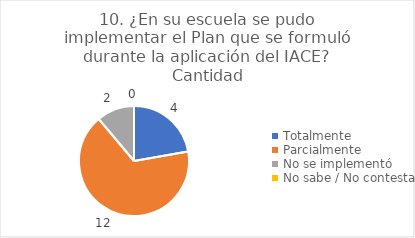
| Category | 10. ¿En su escuela se pudo implementar el Plan que se formuló durante la aplicación del IACE? |
|---|---|
| Totalmente  | 0.222 |
| Parcialmente  | 0.667 |
| No se implementó  | 0.111 |
| No sabe / No contesta | 0 |